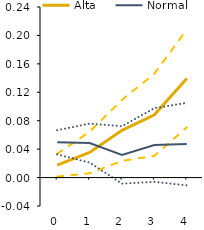
| Category | Alta | Series 4 | Series 5 | Normal | Series 1 | Series 2 |
|---|---|---|---|---|---|---|
| 0.0 | 0.017 | 0.033 | 0.001 | 0.05 | 0.067 | 0.033 |
| 1.0 | 0.035 | 0.065 | 0.006 | 0.048 | 0.076 | 0.021 |
| 2.0 | 0.066 | 0.109 | 0.023 | 0.032 | 0.072 | -0.009 |
| 3.0 | 0.088 | 0.146 | 0.031 | 0.046 | 0.098 | -0.006 |
| 4.0 | 0.139 | 0.208 | 0.071 | 0.047 | 0.105 | -0.011 |